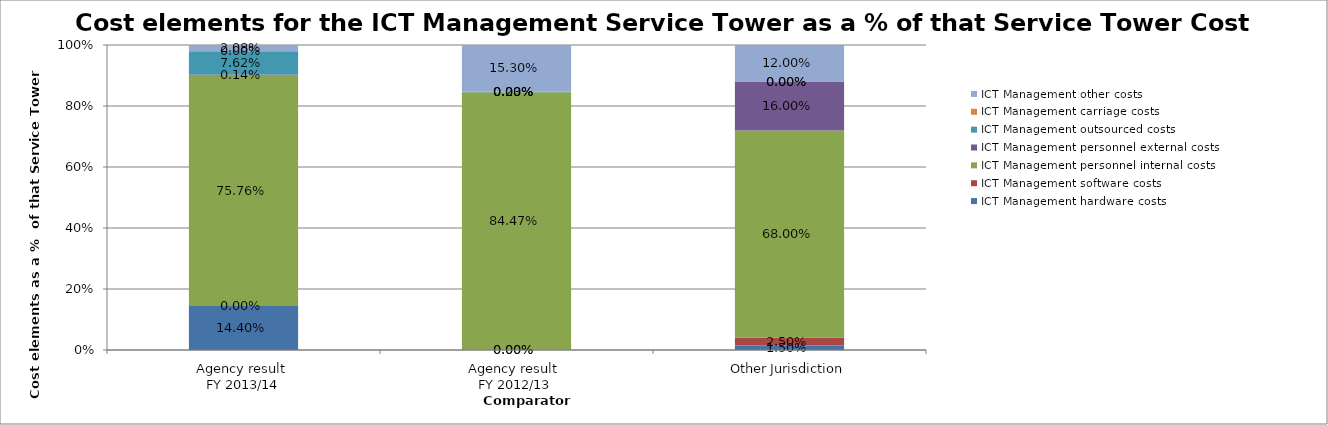
| Category | ICT Management hardware costs | ICT Management software costs | ICT Management personnel internal costs | ICT Management personnel external costs | ICT Management outsourced costs | ICT Management carriage costs | ICT Management other costs |
|---|---|---|---|---|---|---|---|
| Agency result 
FY 2013/14 | 0.144 | 0 | 0.758 | 0.001 | 0.076 | 0 | 0.021 |
| Agency result 
FY 2012/13 | 0 | 0 | 0.845 | 0 | 0.002 | 0 | 0.153 |
| Other Jurisdiction | 0.015 | 0.025 | 0.68 | 0.16 | 0 | 0 | 0.12 |